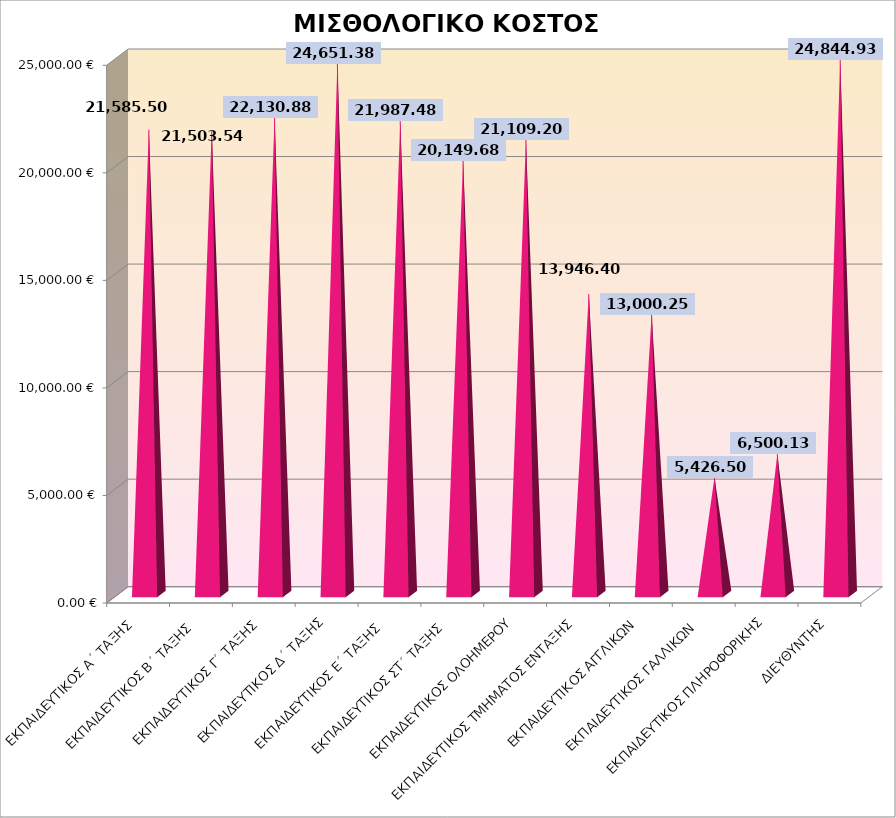
| Category | ΠΟΣΟ |
|---|---|
| ΕΚΠΑΙΔΕΥΤΙΚΟΣ Α΄ ΤΑΞΗΣ  | 21585.5 |
| ΕΚΠΑΙΔΕΥΤΙΚΟΣ Β΄ ΤΑΞΗΣ  | 21503.54 |
| ΕΚΠΑΙΔΕΥΤΙΚΟΣ Γ΄ ΤΑΞΗΣ | 22130.88 |
| ΕΚΠΑΙΔΕΥΤΙΚΟΣ Δ΄ ΤΑΞΗΣ | 24651.38 |
| ΕΚΠΑΙΔΕΥΤΙΚΟΣ Ε΄ ΤΑΞΗΣ  | 21987.48 |
| ΕΚΠΑΙΔΕΥΤΙΚΟΣ ΣΤ΄ ΤΑΞΗΣ  | 20149.68 |
| ΕΚΠΑΙΔΕΥΤΙΚΟΣ ΟΛΟΗΜΕΡΟΥ | 21109.2 |
| ΕΚΠΑΙΔΕΥΤΙΚΟΣ ΤΜΗΜΑΤΟΣ ΕΝΤΑΞΗΣ | 13946.4 |
| ΕΚΠΑΙΔΕΥΤΙΚΟΣ ΑΓΓΛΙΚΩΝ | 13000.25 |
| ΕΚΠΑΙΔΕΥΤΙΚΟΣ ΓΑΛΛΙΚΩΝ  | 5426.5 |
| ΕΚΠΑΙΔΕΥΤΙΚΟΣ ΠΛΗΡΟΦΟΡΙΚΗΣ | 6500.13 |
| ΔΙΕΥΘΥΝΤΗΣ | 24844.93 |